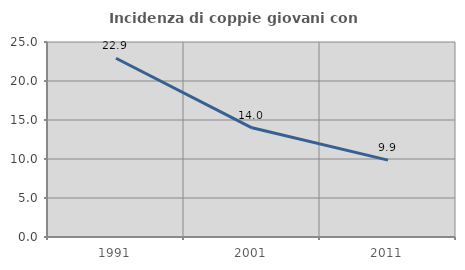
| Category | Incidenza di coppie giovani con figli |
|---|---|
| 1991.0 | 22.913 |
| 2001.0 | 13.997 |
| 2011.0 | 9.859 |